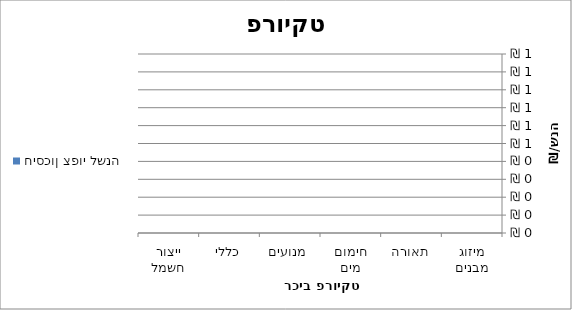
| Category | חיסכון צפוי לשנה |
|---|---|
| מיזוג מבנים | 0 |
| תאורה | 0 |
| חימום מים | 0 |
| מנועים | 0 |
| כללי | 0 |
| ייצור חשמל | 0 |